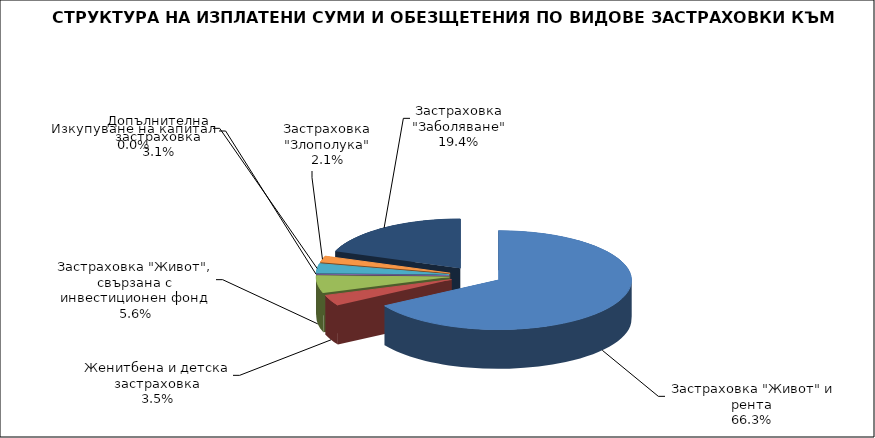
| Category | Series 0 |
|---|---|
|  Застраховка "Живот" и рента | 23839289.51 |
| Женитбена и детска застраховка | 1253034.322 |
| Застраховка "Живот", свързана с инвестиционен фонд | 2031715.248 |
| Изкупуване на капитал | 0 |
| Допълнителна застраховка | 1118864.892 |
| Застраховка "Злополука" | 743516.205 |
| Застраховка "Заболяване" | 6976394.814 |